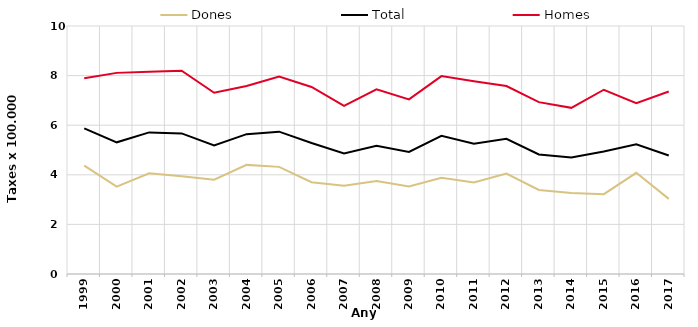
| Category | Dones | Total | Homes |
|---|---|---|---|
| 1999.0 | 4.37 | 5.87 | 7.89 |
| 2000.0 | 3.52 | 5.31 | 8.11 |
| 2001.0 | 4.06 | 5.71 | 8.16 |
| 2002.0 | 3.94 | 5.67 | 8.2 |
| 2003.0 | 3.8 | 5.18 | 7.31 |
| 2004.0 | 4.4 | 5.64 | 7.58 |
| 2005.0 | 4.32 | 5.74 | 7.96 |
| 2006.0 | 3.7 | 5.28 | 7.54 |
| 2007.0 | 3.56 | 4.86 | 6.78 |
| 2008.0 | 3.75 | 5.17 | 7.45 |
| 2009.0 | 3.53 | 4.92 | 7.04 |
| 2010.0 | 3.88 | 5.57 | 7.98 |
| 2011.0 | 3.69 | 5.25 | 7.77 |
| 2012.0 | 4.05 | 5.45 | 7.58 |
| 2013.0 | 3.39 | 4.82 | 6.93 |
| 2014.0 | 3.27 | 4.7 | 6.7 |
| 2015.0 | 3.22 | 4.94 | 7.43 |
| 2016.0 | 4.08 | 5.23 | 6.89 |
| 2017.0 | 3.03 | 4.78 | 7.36 |